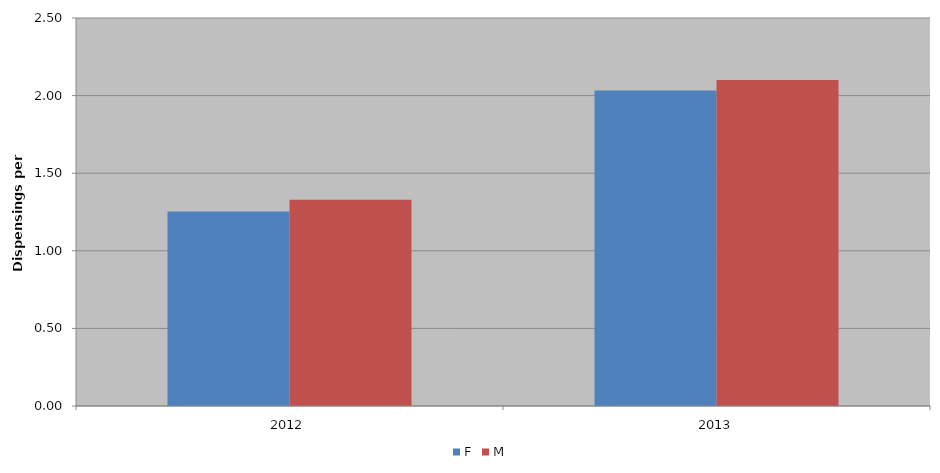
| Category | F | M |
|---|---|---|
| 2012 | 1.253 | 1.329 |
| 2013 | 2.033 | 2.1 |